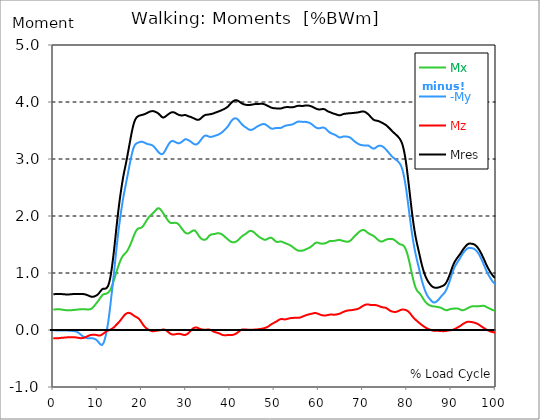
| Category |  Mx |  -My |  Mz |  Mres |
|---|---|---|---|---|
| 0.0 | 0.357 | -0.003 | -0.145 | 0.627 |
| 0.167348456675344 | 0.358 | -0.004 | -0.145 | 0.628 |
| 0.334696913350688 | 0.36 | -0.006 | -0.145 | 0.629 |
| 0.5020453700260321 | 0.362 | -0.008 | -0.146 | 0.63 |
| 0.669393826701376 | 0.363 | -0.009 | -0.146 | 0.632 |
| 0.83674228337672 | 0.365 | -0.011 | -0.146 | 0.633 |
| 1.0040907400520642 | 0.366 | -0.011 | -0.145 | 0.633 |
| 1.1621420602454444 | 0.366 | -0.011 | -0.144 | 0.633 |
| 1.3294905169207885 | 0.365 | -0.01 | -0.142 | 0.633 |
| 1.4968389735961325 | 0.363 | -0.01 | -0.141 | 0.632 |
| 1.6641874302714765 | 0.361 | -0.009 | -0.139 | 0.63 |
| 1.8315358869468206 | 0.359 | -0.009 | -0.137 | 0.63 |
| 1.9988843436221646 | 0.357 | -0.009 | -0.136 | 0.629 |
| 2.1662328002975086 | 0.355 | -0.009 | -0.135 | 0.628 |
| 2.333581256972853 | 0.352 | -0.009 | -0.134 | 0.627 |
| 2.5009297136481967 | 0.35 | -0.009 | -0.133 | 0.626 |
| 2.6682781703235405 | 0.349 | -0.009 | -0.132 | 0.625 |
| 2.8356266269988843 | 0.347 | -0.01 | -0.131 | 0.624 |
| 3.002975083674229 | 0.347 | -0.01 | -0.13 | 0.624 |
| 3.1703235403495724 | 0.346 | -0.01 | -0.127 | 0.623 |
| 3.337671997024917 | 0.346 | -0.011 | -0.126 | 0.624 |
| 3.4957233172182973 | 0.345 | -0.011 | -0.125 | 0.624 |
| 3.663071773893641 | 0.346 | -0.012 | -0.125 | 0.625 |
| 3.8304202305689854 | 0.346 | -0.013 | -0.125 | 0.626 |
| 3.997768687244329 | 0.347 | -0.014 | -0.125 | 0.627 |
| 4.165117143919673 | 0.349 | -0.016 | -0.125 | 0.628 |
| 4.332465600595017 | 0.35 | -0.017 | -0.125 | 0.629 |
| 4.499814057270361 | 0.351 | -0.018 | -0.126 | 0.63 |
| 4.667162513945706 | 0.352 | -0.02 | -0.126 | 0.632 |
| 4.834510970621049 | 0.353 | -0.021 | -0.127 | 0.632 |
| 5.001859427296393 | 0.355 | -0.024 | -0.13 | 0.632 |
| 5.169207883971737 | 0.356 | -0.028 | -0.131 | 0.632 |
| 5.336556340647081 | 0.357 | -0.032 | -0.133 | 0.63 |
| 5.503904797322425 | 0.358 | -0.039 | -0.135 | 0.632 |
| 5.671253253997769 | 0.36 | -0.048 | -0.137 | 0.632 |
| 5.82930457419115 | 0.361 | -0.058 | -0.14 | 0.632 |
| 5.996653030866494 | 0.363 | -0.069 | -0.142 | 0.632 |
| 6.164001487541838 | 0.365 | -0.08 | -0.144 | 0.632 |
| 6.331349944217181 | 0.365 | -0.091 | -0.144 | 0.632 |
| 6.498698400892526 | 0.365 | -0.101 | -0.143 | 0.632 |
| 6.66604685756787 | 0.365 | -0.111 | -0.141 | 0.63 |
| 6.833395314243213 | 0.365 | -0.119 | -0.137 | 0.629 |
| 7.000743770918558 | 0.363 | -0.126 | -0.133 | 0.628 |
| 7.168092227593902 | 0.362 | -0.132 | -0.127 | 0.625 |
| 7.335440684269246 | 0.362 | -0.136 | -0.123 | 0.622 |
| 7.50278914094459 | 0.361 | -0.141 | -0.117 | 0.617 |
| 7.6701375976199335 | 0.361 | -0.144 | -0.111 | 0.613 |
| 7.837486054295278 | 0.361 | -0.145 | -0.105 | 0.607 |
| 7.995537374488658 | 0.361 | -0.145 | -0.1 | 0.602 |
| 8.162885831164003 | 0.361 | -0.144 | -0.094 | 0.595 |
| 8.330234287839346 | 0.365 | -0.143 | -0.09 | 0.589 |
| 8.49758274451469 | 0.369 | -0.143 | -0.088 | 0.586 |
| 8.664931201190035 | 0.377 | -0.143 | -0.085 | 0.583 |
| 8.832279657865378 | 0.388 | -0.145 | -0.084 | 0.582 |
| 8.999628114540721 | 0.4 | -0.147 | -0.083 | 0.583 |
| 9.166976571216066 | 0.416 | -0.152 | -0.083 | 0.585 |
| 9.334325027891412 | 0.431 | -0.156 | -0.083 | 0.591 |
| 9.501673484566755 | 0.447 | -0.162 | -0.084 | 0.596 |
| 9.669021941242098 | 0.463 | -0.17 | -0.086 | 0.603 |
| 9.836370397917442 | 0.479 | -0.18 | -0.09 | 0.611 |
| 10.003718854592787 | 0.495 | -0.193 | -0.093 | 0.619 |
| 10.17106731126813 | 0.513 | -0.208 | -0.096 | 0.632 |
| 10.329118631461512 | 0.532 | -0.226 | -0.099 | 0.647 |
| 10.496467088136853 | 0.551 | -0.243 | -0.098 | 0.664 |
| 10.663815544812199 | 0.57 | -0.255 | -0.094 | 0.681 |
| 10.831164001487544 | 0.588 | -0.263 | -0.088 | 0.698 |
| 10.998512458162887 | 0.605 | -0.263 | -0.08 | 0.712 |
| 11.16586091483823 | 0.618 | -0.253 | -0.07 | 0.722 |
| 11.333209371513574 | 0.626 | -0.23 | -0.061 | 0.726 |
| 11.50055782818892 | 0.63 | -0.195 | -0.051 | 0.725 |
| 11.667906284864264 | 0.633 | -0.152 | -0.042 | 0.724 |
| 11.835254741539607 | 0.635 | -0.1 | -0.034 | 0.726 |
| 12.00260319821495 | 0.638 | -0.039 | -0.025 | 0.734 |
| 12.169951654890292 | 0.644 | 0.029 | -0.019 | 0.748 |
| 12.337300111565641 | 0.652 | 0.105 | -0.012 | 0.769 |
| 12.504648568240984 | 0.664 | 0.193 | -0.007 | 0.802 |
| 12.662699888434362 | 0.678 | 0.291 | 0 | 0.847 |
| 12.830048345109708 | 0.698 | 0.399 | 0.006 | 0.904 |
| 12.997396801785053 | 0.724 | 0.511 | 0.011 | 0.975 |
| 13.164745258460396 | 0.755 | 0.626 | 0.018 | 1.059 |
| 13.33209371513574 | 0.791 | 0.74 | 0.025 | 1.155 |
| 13.499442171811083 | 0.829 | 0.857 | 0.034 | 1.257 |
| 13.666790628486426 | 0.869 | 0.976 | 0.045 | 1.366 |
| 13.834139085161771 | 0.909 | 1.099 | 0.059 | 1.483 |
| 14.001487541837117 | 0.951 | 1.225 | 0.072 | 1.603 |
| 14.16883599851246 | 0.993 | 1.351 | 0.085 | 1.726 |
| 14.336184455187803 | 1.035 | 1.473 | 0.099 | 1.847 |
| 14.503532911863147 | 1.075 | 1.59 | 0.112 | 1.963 |
| 14.670881368538492 | 1.115 | 1.702 | 0.125 | 2.075 |
| 14.828932688731873 | 1.152 | 1.807 | 0.14 | 2.182 |
| 14.996281145407215 | 1.187 | 1.907 | 0.154 | 2.283 |
| 15.163629602082558 | 1.219 | 2.001 | 0.17 | 2.377 |
| 15.330978058757903 | 1.248 | 2.089 | 0.186 | 2.464 |
| 15.498326515433247 | 1.273 | 2.174 | 0.204 | 2.548 |
| 15.665674972108594 | 1.294 | 2.258 | 0.222 | 2.628 |
| 15.833023428783937 | 1.312 | 2.336 | 0.238 | 2.704 |
| 16.00037188545928 | 1.325 | 2.407 | 0.255 | 2.77 |
| 16.167720342134626 | 1.339 | 2.472 | 0.268 | 2.832 |
| 16.335068798809967 | 1.352 | 2.536 | 0.28 | 2.895 |
| 16.502417255485312 | 1.366 | 2.602 | 0.289 | 2.96 |
| 16.669765712160658 | 1.385 | 2.667 | 0.296 | 3.026 |
| 16.837114168836 | 1.406 | 2.735 | 0.3 | 3.096 |
| 17.004462625511344 | 1.429 | 2.802 | 0.301 | 3.167 |
| 17.16251394570472 | 1.456 | 2.87 | 0.3 | 3.238 |
| 17.32986240238007 | 1.485 | 2.935 | 0.297 | 3.309 |
| 17.497210859055414 | 1.515 | 2.998 | 0.291 | 3.378 |
| 17.664559315730756 | 1.547 | 3.059 | 0.284 | 3.446 |
| 17.8319077724061 | 1.58 | 3.115 | 0.274 | 3.509 |
| 17.999256229081443 | 1.613 | 3.162 | 0.264 | 3.567 |
| 18.166604685756788 | 1.647 | 3.201 | 0.254 | 3.617 |
| 18.333953142432133 | 1.679 | 3.232 | 0.245 | 3.658 |
| 18.501301599107478 | 1.709 | 3.253 | 0.237 | 3.69 |
| 18.668650055782823 | 1.734 | 3.266 | 0.23 | 3.713 |
| 18.835998512458165 | 1.755 | 3.275 | 0.224 | 3.731 |
| 19.00334696913351 | 1.771 | 3.282 | 0.216 | 3.743 |
| 19.170695425808855 | 1.781 | 3.286 | 0.208 | 3.752 |
| 19.338043882484197 | 1.785 | 3.292 | 0.197 | 3.757 |
| 19.496095202677576 | 1.787 | 3.298 | 0.182 | 3.763 |
| 19.66344365935292 | 1.789 | 3.301 | 0.165 | 3.766 |
| 19.830792116028263 | 1.793 | 3.303 | 0.145 | 3.77 |
| 19.998140572703612 | 1.802 | 3.303 | 0.126 | 3.773 |
| 20.165489029378953 | 1.813 | 3.301 | 0.106 | 3.776 |
| 20.3328374860543 | 1.828 | 3.296 | 0.089 | 3.78 |
| 20.500185942729644 | 1.847 | 3.291 | 0.072 | 3.783 |
| 20.667534399404985 | 1.868 | 3.284 | 0.057 | 3.787 |
| 20.83488285608033 | 1.89 | 3.278 | 0.043 | 3.794 |
| 21.002231312755672 | 1.912 | 3.271 | 0.032 | 3.799 |
| 21.16957976943102 | 1.934 | 3.266 | 0.022 | 3.806 |
| 21.336928226106362 | 1.952 | 3.262 | 0.012 | 3.813 |
| 21.504276682781704 | 1.97 | 3.259 | 0.004 | 3.819 |
| 21.67162513945705 | 1.986 | 3.257 | -0.002 | 3.826 |
| 21.82967645965043 | 2 | 3.254 | -0.009 | 3.832 |
| 21.997024916325774 | 2.013 | 3.251 | -0.013 | 3.836 |
| 22.16437337300112 | 2.025 | 3.247 | -0.018 | 3.839 |
| 22.33172182967646 | 2.038 | 3.241 | -0.02 | 3.842 |
| 22.499070286351806 | 2.049 | 3.233 | -0.021 | 3.84 |
| 22.666418743027148 | 2.061 | 3.222 | -0.021 | 3.838 |
| 22.833767199702496 | 2.074 | 3.209 | -0.02 | 3.835 |
| 23.00111565637784 | 2.089 | 3.194 | -0.018 | 3.83 |
| 23.168464113053183 | 2.104 | 3.178 | -0.016 | 3.825 |
| 23.335812569728528 | 2.119 | 3.161 | -0.012 | 3.819 |
| 23.50316102640387 | 2.131 | 3.143 | -0.01 | 3.812 |
| 23.670509483079215 | 2.136 | 3.128 | -0.009 | 3.803 |
| 23.83785793975456 | 2.136 | 3.115 | -0.007 | 3.792 |
| 23.995909259947936 | 2.131 | 3.102 | -0.006 | 3.78 |
| 24.163257716623285 | 2.12 | 3.094 | -0.002 | 3.766 |
| 24.330606173298627 | 2.103 | 3.086 | 0 | 3.751 |
| 24.49795462997397 | 2.086 | 3.083 | 0.003 | 3.739 |
| 24.665303086649313 | 2.068 | 3.086 | 0.007 | 3.73 |
| 24.83265154332466 | 2.049 | 3.095 | 0.009 | 3.726 |
| 25.0 | 2.029 | 3.11 | 0.008 | 3.729 |
| 25.167348456675345 | 2.009 | 3.131 | 0.006 | 3.735 |
| 25.334696913350694 | 1.989 | 3.155 | 0.001 | 3.744 |
| 25.502045370026035 | 1.969 | 3.179 | -0.007 | 3.755 |
| 25.669393826701377 | 1.949 | 3.204 | -0.016 | 3.765 |
| 25.836742283376722 | 1.93 | 3.229 | -0.027 | 3.776 |
| 26.004090740052067 | 1.912 | 3.251 | -0.038 | 3.786 |
| 26.17143919672741 | 1.897 | 3.271 | -0.049 | 3.795 |
| 26.329490516920792 | 1.886 | 3.288 | -0.059 | 3.804 |
| 26.49683897359613 | 1.879 | 3.302 | -0.068 | 3.812 |
| 26.66418743027148 | 1.876 | 3.311 | -0.073 | 3.817 |
| 26.831535886946828 | 1.875 | 3.315 | -0.078 | 3.82 |
| 26.998884343622166 | 1.876 | 3.316 | -0.08 | 3.822 |
| 27.166232800297514 | 1.878 | 3.313 | -0.08 | 3.82 |
| 27.333581256972852 | 1.88 | 3.309 | -0.078 | 3.817 |
| 27.5009297136482 | 1.88 | 3.301 | -0.075 | 3.811 |
| 27.668278170323543 | 1.879 | 3.293 | -0.073 | 3.804 |
| 27.835626626998888 | 1.876 | 3.286 | -0.071 | 3.795 |
| 28.002975083674233 | 1.871 | 3.28 | -0.069 | 3.787 |
| 28.170323540349575 | 1.864 | 3.275 | -0.068 | 3.781 |
| 28.33767199702492 | 1.852 | 3.274 | -0.066 | 3.775 |
| 28.50502045370026 | 1.837 | 3.278 | -0.068 | 3.771 |
| 28.663071773893645 | 1.82 | 3.283 | -0.069 | 3.767 |
| 28.830420230568986 | 1.803 | 3.29 | -0.072 | 3.765 |
| 28.99776868724433 | 1.784 | 3.299 | -0.075 | 3.764 |
| 29.165117143919673 | 1.766 | 3.309 | -0.08 | 3.764 |
| 29.33246560059502 | 1.748 | 3.319 | -0.084 | 3.766 |
| 29.499814057270367 | 1.733 | 3.331 | -0.088 | 3.77 |
| 29.66716251394571 | 1.719 | 3.342 | -0.089 | 3.772 |
| 29.834510970621054 | 1.707 | 3.347 | -0.086 | 3.772 |
| 30.00185942729639 | 1.699 | 3.348 | -0.082 | 3.768 |
| 30.169207883971744 | 1.694 | 3.345 | -0.076 | 3.763 |
| 30.33655634064708 | 1.692 | 3.339 | -0.068 | 3.756 |
| 30.50390479732243 | 1.694 | 3.332 | -0.058 | 3.751 |
| 30.671253253997772 | 1.7 | 3.324 | -0.044 | 3.746 |
| 30.829304574191156 | 1.707 | 3.317 | -0.031 | 3.743 |
| 30.996653030866494 | 1.716 | 3.309 | -0.017 | 3.74 |
| 31.164001487541842 | 1.725 | 3.299 | -0.002 | 3.735 |
| 31.331349944217187 | 1.734 | 3.288 | 0.011 | 3.729 |
| 31.498698400892525 | 1.743 | 3.278 | 0.022 | 3.723 |
| 31.666046857567874 | 1.748 | 3.268 | 0.032 | 3.716 |
| 31.833395314243212 | 1.75 | 3.261 | 0.04 | 3.711 |
| 32.00074377091856 | 1.745 | 3.257 | 0.043 | 3.704 |
| 32.1680922275939 | 1.734 | 3.254 | 0.045 | 3.698 |
| 32.33544068426925 | 1.717 | 3.257 | 0.044 | 3.691 |
| 32.50278914094459 | 1.699 | 3.262 | 0.042 | 3.688 |
| 32.670137597619934 | 1.678 | 3.271 | 0.037 | 3.686 |
| 32.83748605429528 | 1.658 | 3.283 | 0.031 | 3.688 |
| 33.004834510970625 | 1.639 | 3.298 | 0.024 | 3.692 |
| 33.162885831164004 | 1.622 | 3.315 | 0.019 | 3.701 |
| 33.33023428783935 | 1.609 | 3.333 | 0.014 | 3.712 |
| 33.497582744514695 | 1.599 | 3.351 | 0.012 | 3.724 |
| 33.664931201190036 | 1.591 | 3.366 | 0.01 | 3.736 |
| 33.83227965786538 | 1.587 | 3.382 | 0.008 | 3.747 |
| 33.99962811454073 | 1.582 | 3.395 | 0.007 | 3.757 |
| 34.16697657121607 | 1.582 | 3.405 | 0.007 | 3.766 |
| 34.33432502789141 | 1.584 | 3.412 | 0.006 | 3.773 |
| 34.50167348456676 | 1.59 | 3.413 | 0.006 | 3.776 |
| 34.6690219412421 | 1.6 | 3.411 | 0.007 | 3.778 |
| 34.83637039791744 | 1.614 | 3.405 | 0.009 | 3.778 |
| 35.00371885459279 | 1.63 | 3.399 | 0.01 | 3.781 |
| 35.17106731126814 | 1.647 | 3.393 | 0.01 | 3.782 |
| 35.338415767943474 | 1.661 | 3.388 | 0.007 | 3.783 |
| 35.49646708813686 | 1.67 | 3.387 | 0.002 | 3.786 |
| 35.6638155448122 | 1.675 | 3.388 | -0.003 | 3.789 |
| 35.831164001487544 | 1.679 | 3.391 | -0.01 | 3.792 |
| 35.998512458162885 | 1.68 | 3.394 | -0.018 | 3.795 |
| 36.165860914838234 | 1.681 | 3.397 | -0.024 | 3.799 |
| 36.333209371513576 | 1.683 | 3.402 | -0.031 | 3.804 |
| 36.50055782818892 | 1.686 | 3.407 | -0.035 | 3.809 |
| 36.667906284864266 | 1.69 | 3.412 | -0.04 | 3.815 |
| 36.83525474153961 | 1.693 | 3.415 | -0.043 | 3.819 |
| 37.002603198214956 | 1.695 | 3.419 | -0.047 | 3.824 |
| 37.1699516548903 | 1.698 | 3.425 | -0.051 | 3.829 |
| 37.337300111565646 | 1.698 | 3.429 | -0.055 | 3.834 |
| 37.50464856824098 | 1.696 | 3.436 | -0.06 | 3.838 |
| 37.66269988843437 | 1.694 | 3.443 | -0.065 | 3.844 |
| 37.83004834510971 | 1.69 | 3.45 | -0.072 | 3.849 |
| 37.99739680178505 | 1.683 | 3.459 | -0.08 | 3.855 |
| 38.16474525846039 | 1.674 | 3.47 | -0.085 | 3.86 |
| 38.33209371513574 | 1.665 | 3.48 | -0.089 | 3.866 |
| 38.49944217181109 | 1.654 | 3.493 | -0.092 | 3.873 |
| 38.666790628486424 | 1.643 | 3.505 | -0.092 | 3.879 |
| 38.83413908516178 | 1.632 | 3.518 | -0.092 | 3.886 |
| 39.001487541837115 | 1.62 | 3.531 | -0.091 | 3.894 |
| 39.16883599851246 | 1.61 | 3.545 | -0.09 | 3.901 |
| 39.336184455187805 | 1.599 | 3.56 | -0.09 | 3.911 |
| 39.503532911863154 | 1.588 | 3.577 | -0.09 | 3.922 |
| 39.670881368538495 | 1.576 | 3.597 | -0.09 | 3.936 |
| 39.83822982521384 | 1.565 | 3.618 | -0.091 | 3.951 |
| 39.996281145407224 | 1.556 | 3.639 | -0.09 | 3.966 |
| 40.163629602082565 | 1.548 | 3.659 | -0.09 | 3.981 |
| 40.33097805875791 | 1.542 | 3.675 | -0.089 | 3.994 |
| 40.498326515433256 | 1.539 | 3.69 | -0.086 | 4.006 |
| 40.6656749721086 | 1.538 | 3.7 | -0.083 | 4.016 |
| 40.83302342878393 | 1.538 | 3.709 | -0.08 | 4.022 |
| 41.00037188545929 | 1.541 | 3.713 | -0.075 | 4.028 |
| 41.16772034213463 | 1.546 | 3.715 | -0.069 | 4.031 |
| 41.33506879880997 | 1.552 | 3.712 | -0.062 | 4.031 |
| 41.50241725548531 | 1.561 | 3.706 | -0.053 | 4.029 |
| 41.66976571216066 | 1.57 | 3.696 | -0.044 | 4.024 |
| 41.837114168836 | 1.582 | 3.684 | -0.034 | 4.018 |
| 42.004462625511344 | 1.594 | 3.669 | -0.023 | 4.009 |
| 42.17181108218669 | 1.609 | 3.652 | -0.013 | 4 |
| 42.32986240238007 | 1.622 | 3.635 | -0.003 | 3.99 |
| 42.497210859055414 | 1.635 | 3.62 | 0.004 | 3.981 |
| 42.66455931573076 | 1.645 | 3.606 | 0.009 | 3.973 |
| 42.831907772406105 | 1.654 | 3.593 | 0.011 | 3.967 |
| 42.999256229081446 | 1.663 | 3.582 | 0.011 | 3.961 |
| 43.16660468575679 | 1.672 | 3.572 | 0.011 | 3.957 |
| 43.33395314243214 | 1.68 | 3.563 | 0.01 | 3.953 |
| 43.50130159910748 | 1.688 | 3.556 | 0.009 | 3.951 |
| 43.66865005578282 | 1.696 | 3.547 | 0.008 | 3.949 |
| 43.83599851245817 | 1.707 | 3.537 | 0.007 | 3.948 |
| 44.00334696913351 | 1.719 | 3.527 | 0.006 | 3.947 |
| 44.17069542580886 | 1.729 | 3.518 | 0.006 | 3.947 |
| 44.3380438824842 | 1.735 | 3.514 | 0.004 | 3.948 |
| 44.49609520267758 | 1.739 | 3.51 | 0.004 | 3.949 |
| 44.66344365935292 | 1.74 | 3.51 | 0.004 | 3.951 |
| 44.83079211602827 | 1.737 | 3.512 | 0.004 | 3.953 |
| 44.99814057270361 | 1.732 | 3.516 | 0.004 | 3.956 |
| 45.16548902937895 | 1.724 | 3.522 | 0.006 | 3.958 |
| 45.332837486054295 | 1.715 | 3.53 | 0.007 | 3.96 |
| 45.500185942729644 | 1.704 | 3.538 | 0.008 | 3.962 |
| 45.66753439940499 | 1.692 | 3.548 | 0.008 | 3.963 |
| 45.83488285608033 | 1.68 | 3.557 | 0.009 | 3.966 |
| 46.00223131275568 | 1.668 | 3.566 | 0.01 | 3.966 |
| 46.16957976943102 | 1.657 | 3.573 | 0.011 | 3.967 |
| 46.336928226106366 | 1.645 | 3.58 | 0.013 | 3.967 |
| 46.50427668278171 | 1.635 | 3.587 | 0.016 | 3.967 |
| 46.671625139457056 | 1.627 | 3.593 | 0.017 | 3.967 |
| 46.829676459650436 | 1.618 | 3.599 | 0.019 | 3.968 |
| 46.99702491632577 | 1.61 | 3.604 | 0.021 | 3.969 |
| 47.16437337300112 | 1.603 | 3.609 | 0.023 | 3.969 |
| 47.33172182967646 | 1.597 | 3.612 | 0.025 | 3.968 |
| 47.49907028635181 | 1.59 | 3.613 | 0.029 | 3.966 |
| 47.66641874302716 | 1.584 | 3.613 | 0.032 | 3.961 |
| 47.83376719970249 | 1.582 | 3.61 | 0.035 | 3.957 |
| 48.001115656377834 | 1.583 | 3.604 | 0.04 | 3.951 |
| 48.16846411305319 | 1.588 | 3.596 | 0.044 | 3.945 |
| 48.33581256972853 | 1.594 | 3.587 | 0.051 | 3.938 |
| 48.50316102640387 | 1.601 | 3.577 | 0.059 | 3.931 |
| 48.67050948307921 | 1.608 | 3.567 | 0.066 | 3.925 |
| 48.837857939754564 | 1.616 | 3.556 | 0.076 | 3.918 |
| 49.005206396429905 | 1.62 | 3.546 | 0.085 | 3.911 |
| 49.163257716623285 | 1.621 | 3.538 | 0.095 | 3.905 |
| 49.33060617329863 | 1.617 | 3.534 | 0.103 | 3.9 |
| 49.49795462997397 | 1.609 | 3.531 | 0.111 | 3.896 |
| 49.66530308664932 | 1.599 | 3.532 | 0.117 | 3.893 |
| 49.832651543324666 | 1.586 | 3.535 | 0.124 | 3.891 |
| 50.0 | 1.572 | 3.538 | 0.131 | 3.89 |
| 50.16734845667534 | 1.56 | 3.541 | 0.137 | 3.889 |
| 50.33469691335069 | 1.551 | 3.545 | 0.144 | 3.888 |
| 50.50204537002604 | 1.545 | 3.546 | 0.152 | 3.887 |
| 50.66939382670139 | 1.543 | 3.546 | 0.161 | 3.886 |
| 50.836742283376715 | 1.545 | 3.545 | 0.17 | 3.885 |
| 51.00409074005207 | 1.548 | 3.543 | 0.178 | 3.884 |
| 51.17143919672741 | 1.552 | 3.542 | 0.185 | 3.884 |
| 51.32949051692079 | 1.555 | 3.543 | 0.191 | 3.885 |
| 51.496838973596134 | 1.552 | 3.547 | 0.193 | 3.887 |
| 51.66418743027148 | 1.548 | 3.552 | 0.193 | 3.89 |
| 51.831535886946824 | 1.542 | 3.56 | 0.191 | 3.895 |
| 51.99888434362217 | 1.537 | 3.568 | 0.188 | 3.899 |
| 52.16623280029752 | 1.532 | 3.575 | 0.186 | 3.904 |
| 52.33358125697285 | 1.527 | 3.58 | 0.185 | 3.907 |
| 52.5009297136482 | 1.521 | 3.584 | 0.186 | 3.909 |
| 52.668278170323546 | 1.516 | 3.589 | 0.189 | 3.91 |
| 52.835626626998895 | 1.51 | 3.591 | 0.194 | 3.911 |
| 53.00297508367424 | 1.506 | 3.593 | 0.197 | 3.911 |
| 53.17032354034958 | 1.5 | 3.594 | 0.201 | 3.91 |
| 53.33767199702492 | 1.495 | 3.597 | 0.204 | 3.91 |
| 53.50502045370027 | 1.488 | 3.598 | 0.206 | 3.909 |
| 53.663071773893655 | 1.48 | 3.6 | 0.208 | 3.908 |
| 53.83042023056899 | 1.473 | 3.602 | 0.209 | 3.908 |
| 53.99776868724433 | 1.463 | 3.606 | 0.211 | 3.908 |
| 54.16511714391967 | 1.453 | 3.61 | 0.212 | 3.909 |
| 54.33246560059503 | 1.443 | 3.616 | 0.213 | 3.911 |
| 54.49981405727037 | 1.433 | 3.623 | 0.214 | 3.915 |
| 54.667162513945705 | 1.423 | 3.631 | 0.214 | 3.919 |
| 54.834510970621054 | 1.414 | 3.639 | 0.214 | 3.924 |
| 55.0018594272964 | 1.405 | 3.647 | 0.214 | 3.928 |
| 55.169207883971744 | 1.398 | 3.652 | 0.214 | 3.931 |
| 55.336556340647086 | 1.394 | 3.655 | 0.214 | 3.932 |
| 55.50390479732243 | 1.391 | 3.657 | 0.215 | 3.934 |
| 55.671253253997776 | 1.388 | 3.657 | 0.216 | 3.932 |
| 55.83860171067312 | 1.388 | 3.655 | 0.219 | 3.932 |
| 55.9966530308665 | 1.389 | 3.654 | 0.224 | 3.931 |
| 56.16400148754184 | 1.391 | 3.652 | 0.229 | 3.93 |
| 56.33134994421718 | 1.393 | 3.651 | 0.235 | 3.93 |
| 56.498698400892536 | 1.396 | 3.651 | 0.24 | 3.931 |
| 56.66604685756788 | 1.401 | 3.652 | 0.246 | 3.934 |
| 56.83339531424321 | 1.406 | 3.652 | 0.252 | 3.937 |
| 57.00074377091856 | 1.413 | 3.651 | 0.256 | 3.938 |
| 57.16809222759391 | 1.418 | 3.649 | 0.26 | 3.939 |
| 57.33544068426925 | 1.424 | 3.647 | 0.265 | 3.939 |
| 57.5027891409446 | 1.428 | 3.644 | 0.269 | 3.938 |
| 57.670137597619934 | 1.435 | 3.641 | 0.273 | 3.938 |
| 57.83748605429528 | 1.442 | 3.637 | 0.276 | 3.936 |
| 58.004834510970625 | 1.449 | 3.631 | 0.278 | 3.932 |
| 58.16288583116401 | 1.458 | 3.624 | 0.281 | 3.928 |
| 58.330234287839346 | 1.467 | 3.616 | 0.285 | 3.924 |
| 58.497582744514695 | 1.477 | 3.607 | 0.287 | 3.918 |
| 58.66493120119004 | 1.488 | 3.596 | 0.29 | 3.911 |
| 58.832279657865385 | 1.501 | 3.584 | 0.294 | 3.905 |
| 58.999628114540734 | 1.514 | 3.572 | 0.297 | 3.898 |
| 59.16697657121607 | 1.524 | 3.562 | 0.298 | 3.891 |
| 59.33432502789142 | 1.53 | 3.553 | 0.297 | 3.885 |
| 59.50167348456676 | 1.534 | 3.547 | 0.294 | 3.879 |
| 59.66902194124211 | 1.535 | 3.541 | 0.29 | 3.875 |
| 59.83637039791745 | 1.532 | 3.539 | 0.285 | 3.871 |
| 60.00371885459278 | 1.528 | 3.539 | 0.28 | 3.869 |
| 60.17106731126813 | 1.522 | 3.54 | 0.275 | 3.868 |
| 60.33841576794349 | 1.518 | 3.543 | 0.269 | 3.869 |
| 60.49646708813685 | 1.516 | 3.546 | 0.265 | 3.871 |
| 60.6638155448122 | 1.515 | 3.549 | 0.26 | 3.874 |
| 60.831164001487544 | 1.516 | 3.551 | 0.257 | 3.876 |
| 60.99851245816289 | 1.516 | 3.552 | 0.256 | 3.877 |
| 61.16586091483824 | 1.517 | 3.55 | 0.255 | 3.876 |
| 61.333209371513576 | 1.519 | 3.546 | 0.255 | 3.873 |
| 61.50055782818892 | 1.522 | 3.537 | 0.255 | 3.866 |
| 61.667906284864266 | 1.527 | 3.525 | 0.256 | 3.857 |
| 61.835254741539615 | 1.532 | 3.51 | 0.258 | 3.847 |
| 62.002603198214956 | 1.539 | 3.497 | 0.261 | 3.839 |
| 62.16995165489029 | 1.547 | 3.485 | 0.264 | 3.833 |
| 62.33730011156564 | 1.556 | 3.474 | 0.267 | 3.827 |
| 62.504648568240995 | 1.561 | 3.465 | 0.269 | 3.823 |
| 62.67199702491633 | 1.563 | 3.458 | 0.271 | 3.817 |
| 62.83004834510971 | 1.563 | 3.452 | 0.273 | 3.813 |
| 62.99739680178505 | 1.562 | 3.445 | 0.271 | 3.806 |
| 63.1647452584604 | 1.562 | 3.439 | 0.269 | 3.801 |
| 63.33209371513575 | 1.562 | 3.435 | 0.268 | 3.797 |
| 63.4994421718111 | 1.563 | 3.43 | 0.268 | 3.794 |
| 63.666790628486424 | 1.566 | 3.425 | 0.269 | 3.789 |
| 63.83413908516177 | 1.568 | 3.418 | 0.27 | 3.786 |
| 64.00148754183712 | 1.571 | 3.409 | 0.273 | 3.782 |
| 64.16883599851248 | 1.576 | 3.401 | 0.276 | 3.776 |
| 64.3361844551878 | 1.578 | 3.392 | 0.278 | 3.772 |
| 64.50353291186315 | 1.58 | 3.384 | 0.281 | 3.768 |
| 64.6708813685385 | 1.581 | 3.38 | 0.285 | 3.766 |
| 64.83822982521384 | 1.579 | 3.377 | 0.289 | 3.766 |
| 65.00557828188919 | 1.575 | 3.38 | 0.295 | 3.771 |
| 65.16362960208257 | 1.571 | 3.385 | 0.301 | 3.776 |
| 65.3309780587579 | 1.567 | 3.391 | 0.309 | 3.782 |
| 65.49832651543326 | 1.562 | 3.394 | 0.315 | 3.787 |
| 65.6656749721086 | 1.559 | 3.396 | 0.32 | 3.791 |
| 65.83302342878395 | 1.556 | 3.396 | 0.326 | 3.793 |
| 66.00037188545929 | 1.553 | 3.396 | 0.33 | 3.795 |
| 66.16772034213463 | 1.551 | 3.395 | 0.335 | 3.796 |
| 66.33506879880998 | 1.55 | 3.393 | 0.338 | 3.797 |
| 66.50241725548531 | 1.549 | 3.391 | 0.341 | 3.799 |
| 66.66976571216065 | 1.55 | 3.388 | 0.343 | 3.801 |
| 66.83711416883601 | 1.553 | 3.385 | 0.345 | 3.802 |
| 67.00446262551135 | 1.559 | 3.381 | 0.346 | 3.803 |
| 67.1718110821867 | 1.568 | 3.373 | 0.347 | 3.804 |
| 67.32986240238007 | 1.579 | 3.364 | 0.348 | 3.804 |
| 67.49721085905541 | 1.592 | 3.352 | 0.349 | 3.805 |
| 67.66455931573076 | 1.608 | 3.34 | 0.351 | 3.806 |
| 67.83190777240611 | 1.623 | 3.327 | 0.353 | 3.808 |
| 67.99925622908145 | 1.637 | 3.316 | 0.357 | 3.809 |
| 68.16660468575678 | 1.65 | 3.306 | 0.359 | 3.811 |
| 68.33395314243214 | 1.662 | 3.296 | 0.361 | 3.812 |
| 68.50130159910749 | 1.674 | 3.286 | 0.363 | 3.814 |
| 68.66865005578282 | 1.688 | 3.278 | 0.367 | 3.815 |
| 68.83599851245816 | 1.7 | 3.27 | 0.37 | 3.817 |
| 69.00334696913352 | 1.712 | 3.262 | 0.375 | 3.819 |
| 69.17069542580886 | 1.724 | 3.255 | 0.381 | 3.822 |
| 69.3380438824842 | 1.734 | 3.251 | 0.389 | 3.826 |
| 69.50539233915956 | 1.743 | 3.248 | 0.398 | 3.829 |
| 69.66344365935292 | 1.748 | 3.244 | 0.407 | 3.832 |
| 69.83079211602826 | 1.753 | 3.242 | 0.416 | 3.834 |
| 69.99814057270362 | 1.755 | 3.24 | 0.423 | 3.834 |
| 70.16548902937896 | 1.755 | 3.238 | 0.43 | 3.833 |
| 70.33283748605429 | 1.752 | 3.237 | 0.437 | 3.829 |
| 70.50018594272964 | 1.745 | 3.237 | 0.441 | 3.825 |
| 70.667534399405 | 1.734 | 3.238 | 0.445 | 3.817 |
| 70.83488285608033 | 1.721 | 3.239 | 0.449 | 3.807 |
| 71.00223131275568 | 1.71 | 3.24 | 0.45 | 3.797 |
| 71.16957976943102 | 1.7 | 3.238 | 0.449 | 3.787 |
| 71.33692822610637 | 1.693 | 3.231 | 0.447 | 3.774 |
| 71.50427668278171 | 1.685 | 3.223 | 0.443 | 3.761 |
| 71.67162513945706 | 1.679 | 3.213 | 0.44 | 3.746 |
| 71.8389735961324 | 1.671 | 3.203 | 0.438 | 3.731 |
| 71.99702491632577 | 1.665 | 3.194 | 0.438 | 3.717 |
| 72.16437337300113 | 1.66 | 3.187 | 0.438 | 3.704 |
| 72.33172182967647 | 1.653 | 3.182 | 0.438 | 3.693 |
| 72.49907028635181 | 1.645 | 3.181 | 0.439 | 3.684 |
| 72.66641874302715 | 1.634 | 3.186 | 0.438 | 3.679 |
| 72.8337671997025 | 1.622 | 3.194 | 0.438 | 3.675 |
| 73.00111565637783 | 1.61 | 3.206 | 0.435 | 3.673 |
| 73.16846411305319 | 1.598 | 3.216 | 0.432 | 3.672 |
| 73.33581256972853 | 1.586 | 3.223 | 0.429 | 3.669 |
| 73.50316102640387 | 1.576 | 3.23 | 0.424 | 3.665 |
| 73.67050948307921 | 1.567 | 3.233 | 0.419 | 3.66 |
| 73.83785793975457 | 1.559 | 3.234 | 0.412 | 3.654 |
| 74.00520639642991 | 1.555 | 3.233 | 0.407 | 3.648 |
| 74.16325771662328 | 1.552 | 3.23 | 0.402 | 3.642 |
| 74.33060617329863 | 1.552 | 3.224 | 0.399 | 3.635 |
| 74.49795462997398 | 1.556 | 3.217 | 0.398 | 3.629 |
| 74.66530308664932 | 1.562 | 3.208 | 0.396 | 3.621 |
| 74.83265154332466 | 1.57 | 3.196 | 0.394 | 3.613 |
| 75.00000000000001 | 1.578 | 3.183 | 0.392 | 3.606 |
| 75.16734845667534 | 1.583 | 3.171 | 0.389 | 3.598 |
| 75.3346969133507 | 1.588 | 3.157 | 0.382 | 3.588 |
| 75.50204537002605 | 1.591 | 3.141 | 0.375 | 3.576 |
| 75.66939382670138 | 1.594 | 3.126 | 0.365 | 3.563 |
| 75.83674228337672 | 1.597 | 3.109 | 0.355 | 3.55 |
| 76.00409074005208 | 1.598 | 3.094 | 0.346 | 3.538 |
| 76.17143919672742 | 1.599 | 3.079 | 0.338 | 3.525 |
| 76.33878765340276 | 1.599 | 3.064 | 0.331 | 3.511 |
| 76.49683897359614 | 1.599 | 3.049 | 0.327 | 3.498 |
| 76.66418743027148 | 1.597 | 3.036 | 0.322 | 3.485 |
| 76.83153588694682 | 1.591 | 3.025 | 0.32 | 3.471 |
| 76.99888434362218 | 1.583 | 3.015 | 0.318 | 3.459 |
| 77.16623280029752 | 1.575 | 3.006 | 0.318 | 3.448 |
| 77.33358125697285 | 1.566 | 2.996 | 0.317 | 3.437 |
| 77.5009297136482 | 1.556 | 2.985 | 0.319 | 3.425 |
| 77.66827817032356 | 1.545 | 2.975 | 0.322 | 3.413 |
| 77.83562662699889 | 1.535 | 2.964 | 0.327 | 3.401 |
| 78.00297508367423 | 1.524 | 2.951 | 0.332 | 3.386 |
| 78.17032354034959 | 1.514 | 2.937 | 0.339 | 3.371 |
| 78.33767199702493 | 1.506 | 2.92 | 0.346 | 3.353 |
| 78.50502045370027 | 1.501 | 2.898 | 0.351 | 3.332 |
| 78.67236891037561 | 1.498 | 2.871 | 0.356 | 3.307 |
| 78.83042023056899 | 1.495 | 2.835 | 0.359 | 3.275 |
| 78.99776868724433 | 1.49 | 2.791 | 0.359 | 3.235 |
| 79.16511714391969 | 1.481 | 2.737 | 0.358 | 3.184 |
| 79.33246560059503 | 1.465 | 2.675 | 0.357 | 3.125 |
| 79.49981405727036 | 1.444 | 2.605 | 0.353 | 3.055 |
| 79.66716251394571 | 1.416 | 2.525 | 0.35 | 2.975 |
| 79.83451097062107 | 1.383 | 2.437 | 0.345 | 2.884 |
| 80.00185942729641 | 1.344 | 2.341 | 0.338 | 2.784 |
| 80.16920788397174 | 1.299 | 2.24 | 0.33 | 2.678 |
| 80.33655634064709 | 1.248 | 2.14 | 0.319 | 2.566 |
| 80.50390479732243 | 1.191 | 2.039 | 0.306 | 2.454 |
| 80.67125325399778 | 1.132 | 1.939 | 0.29 | 2.341 |
| 80.83860171067312 | 1.07 | 1.842 | 0.274 | 2.228 |
| 80.99665303086651 | 1.009 | 1.745 | 0.256 | 2.117 |
| 81.16400148754184 | 0.95 | 1.655 | 0.24 | 2.013 |
| 81.3313499442172 | 0.895 | 1.572 | 0.225 | 1.916 |
| 81.49869840089255 | 0.844 | 1.496 | 0.211 | 1.826 |
| 81.66604685756786 | 0.799 | 1.425 | 0.197 | 1.743 |
| 81.83339531424322 | 0.758 | 1.36 | 0.184 | 1.666 |
| 82.00074377091858 | 0.726 | 1.299 | 0.173 | 1.598 |
| 82.16809222759392 | 0.7 | 1.243 | 0.162 | 1.536 |
| 82.33544068426926 | 0.68 | 1.19 | 0.151 | 1.477 |
| 82.50278914094459 | 0.666 | 1.136 | 0.14 | 1.42 |
| 82.67013759761994 | 0.655 | 1.08 | 0.129 | 1.363 |
| 82.83748605429528 | 0.643 | 1.024 | 0.117 | 1.305 |
| 83.00483451097062 | 0.626 | 0.968 | 0.106 | 1.248 |
| 83.17218296764597 | 0.606 | 0.915 | 0.096 | 1.191 |
| 83.33023428783935 | 0.585 | 0.864 | 0.086 | 1.139 |
| 83.4975827445147 | 0.564 | 0.819 | 0.076 | 1.09 |
| 83.66493120119004 | 0.543 | 0.776 | 0.068 | 1.046 |
| 83.83227965786537 | 0.524 | 0.737 | 0.059 | 1.006 |
| 83.99962811454073 | 0.505 | 0.7 | 0.05 | 0.97 |
| 84.16697657121607 | 0.489 | 0.667 | 0.041 | 0.936 |
| 84.33432502789142 | 0.475 | 0.638 | 0.034 | 0.907 |
| 84.50167348456677 | 0.463 | 0.613 | 0.028 | 0.883 |
| 84.6690219412421 | 0.453 | 0.591 | 0.022 | 0.86 |
| 84.83637039791745 | 0.444 | 0.571 | 0.017 | 0.84 |
| 85.0037188545928 | 0.437 | 0.554 | 0.011 | 0.821 |
| 85.17106731126813 | 0.43 | 0.539 | 0.007 | 0.803 |
| 85.33841576794349 | 0.424 | 0.524 | 0.001 | 0.788 |
| 85.50576422461883 | 0.42 | 0.51 | -0.004 | 0.773 |
| 85.66381554481221 | 0.418 | 0.496 | -0.009 | 0.762 |
| 85.83116400148755 | 0.416 | 0.488 | -0.012 | 0.753 |
| 85.99851245816289 | 0.414 | 0.482 | -0.014 | 0.748 |
| 86.16586091483823 | 0.413 | 0.481 | -0.016 | 0.743 |
| 86.33320937151358 | 0.411 | 0.484 | -0.016 | 0.741 |
| 86.50055782818893 | 0.409 | 0.492 | -0.016 | 0.741 |
| 86.66790628486427 | 0.407 | 0.501 | -0.014 | 0.741 |
| 86.83525474153961 | 0.404 | 0.513 | -0.014 | 0.742 |
| 87.00260319821496 | 0.402 | 0.525 | -0.014 | 0.745 |
| 87.16995165489031 | 0.4 | 0.54 | -0.016 | 0.748 |
| 87.33730011156564 | 0.397 | 0.555 | -0.017 | 0.752 |
| 87.504648568241 | 0.393 | 0.571 | -0.018 | 0.757 |
| 87.67199702491634 | 0.389 | 0.587 | -0.018 | 0.762 |
| 87.83004834510972 | 0.383 | 0.602 | -0.019 | 0.768 |
| 87.99739680178506 | 0.376 | 0.616 | -0.02 | 0.772 |
| 88.1647452584604 | 0.368 | 0.629 | -0.02 | 0.778 |
| 88.33209371513574 | 0.36 | 0.643 | -0.02 | 0.786 |
| 88.49944217181108 | 0.355 | 0.659 | -0.02 | 0.797 |
| 88.66679062848644 | 0.35 | 0.679 | -0.019 | 0.811 |
| 88.83413908516178 | 0.347 | 0.705 | -0.016 | 0.831 |
| 89.00148754183712 | 0.347 | 0.734 | -0.012 | 0.857 |
| 89.16883599851246 | 0.351 | 0.765 | -0.01 | 0.884 |
| 89.33618445518782 | 0.356 | 0.798 | -0.008 | 0.914 |
| 89.50353291186315 | 0.361 | 0.834 | -0.007 | 0.946 |
| 89.6708813685385 | 0.366 | 0.873 | -0.006 | 0.981 |
| 89.83822982521386 | 0.369 | 0.914 | -0.004 | 1.018 |
| 90.00557828188919 | 0.371 | 0.955 | -0.002 | 1.056 |
| 90.16362960208257 | 0.372 | 0.995 | 0 | 1.093 |
| 90.3309780587579 | 0.373 | 1.033 | 0.004 | 1.127 |
| 90.49832651543326 | 0.376 | 1.066 | 0.009 | 1.157 |
| 90.66567497210859 | 0.377 | 1.095 | 0.014 | 1.184 |
| 90.83302342878395 | 0.378 | 1.12 | 0.02 | 1.208 |
| 91.00037188545929 | 0.379 | 1.142 | 0.027 | 1.228 |
| 91.16772034213463 | 0.379 | 1.163 | 0.034 | 1.248 |
| 91.33506879880998 | 0.378 | 1.184 | 0.042 | 1.266 |
| 91.50241725548533 | 0.376 | 1.206 | 0.049 | 1.284 |
| 91.66976571216065 | 0.371 | 1.225 | 0.055 | 1.301 |
| 91.83711416883601 | 0.365 | 1.247 | 0.063 | 1.319 |
| 92.00446262551137 | 0.358 | 1.268 | 0.071 | 1.336 |
| 92.1718110821867 | 0.352 | 1.29 | 0.08 | 1.356 |
| 92.33915953886203 | 0.348 | 1.312 | 0.09 | 1.376 |
| 92.49721085905541 | 0.347 | 1.333 | 0.1 | 1.397 |
| 92.66455931573077 | 0.348 | 1.353 | 0.109 | 1.416 |
| 92.83190777240611 | 0.351 | 1.37 | 0.115 | 1.433 |
| 92.99925622908145 | 0.356 | 1.385 | 0.123 | 1.449 |
| 93.1666046857568 | 0.361 | 1.399 | 0.13 | 1.465 |
| 93.33395314243214 | 0.368 | 1.412 | 0.136 | 1.479 |
| 93.50130159910749 | 0.375 | 1.424 | 0.141 | 1.493 |
| 93.66865005578283 | 0.383 | 1.433 | 0.144 | 1.504 |
| 93.83599851245818 | 0.39 | 1.439 | 0.146 | 1.511 |
| 94.00334696913353 | 0.397 | 1.442 | 0.145 | 1.516 |
| 94.17069542580886 | 0.403 | 1.442 | 0.143 | 1.516 |
| 94.3380438824842 | 0.408 | 1.439 | 0.142 | 1.516 |
| 94.50539233915954 | 0.412 | 1.437 | 0.14 | 1.515 |
| 94.66344365935292 | 0.414 | 1.435 | 0.139 | 1.512 |
| 94.83079211602828 | 0.416 | 1.433 | 0.135 | 1.51 |
| 94.99814057270362 | 0.417 | 1.428 | 0.133 | 1.507 |
| 95.16548902937897 | 0.418 | 1.422 | 0.129 | 1.501 |
| 95.33283748605432 | 0.419 | 1.413 | 0.125 | 1.493 |
| 95.50018594272963 | 0.419 | 1.402 | 0.121 | 1.483 |
| 95.66753439940499 | 0.418 | 1.388 | 0.116 | 1.47 |
| 95.83488285608034 | 0.418 | 1.373 | 0.11 | 1.456 |
| 96.00223131275567 | 0.418 | 1.356 | 0.103 | 1.439 |
| 96.16957976943102 | 0.418 | 1.336 | 0.096 | 1.42 |
| 96.33692822610638 | 0.419 | 1.314 | 0.088 | 1.401 |
| 96.50427668278171 | 0.42 | 1.29 | 0.079 | 1.377 |
| 96.67162513945706 | 0.421 | 1.263 | 0.07 | 1.353 |
| 96.8389735961324 | 0.423 | 1.234 | 0.061 | 1.327 |
| 96.99702491632577 | 0.424 | 1.206 | 0.052 | 1.301 |
| 97.16437337300111 | 0.425 | 1.176 | 0.042 | 1.273 |
| 97.33172182967647 | 0.424 | 1.145 | 0.034 | 1.245 |
| 97.49907028635181 | 0.422 | 1.115 | 0.025 | 1.217 |
| 97.66641874302715 | 0.416 | 1.084 | 0.018 | 1.187 |
| 97.8337671997025 | 0.409 | 1.054 | 0.011 | 1.157 |
| 98.00111565637785 | 0.401 | 1.025 | 0.003 | 1.129 |
| 98.16846411305319 | 0.394 | 0.998 | -0.003 | 1.102 |
| 98.33581256972855 | 0.389 | 0.974 | -0.009 | 1.079 |
| 98.50316102640389 | 0.382 | 0.952 | -0.016 | 1.057 |
| 98.67050948307921 | 0.376 | 0.929 | -0.021 | 1.034 |
| 98.83785793975456 | 0.369 | 0.907 | -0.027 | 1.013 |
| 99.0052063964299 | 0.362 | 0.888 | -0.031 | 0.993 |
| 99.17255485310525 | 0.356 | 0.868 | -0.034 | 0.974 |
| 99.33060617329863 | 0.35 | 0.85 | -0.037 | 0.956 |
| 99.49795462997399 | 0.345 | 0.834 | -0.04 | 0.941 |
| 99.66530308664933 | 0.342 | 0.821 | -0.042 | 0.929 |
| 99.83265154332467 | 0.34 | 0.81 | -0.045 | 0.92 |
| 100.0 | 0.339 | 0.804 | -0.047 | 0.914 |